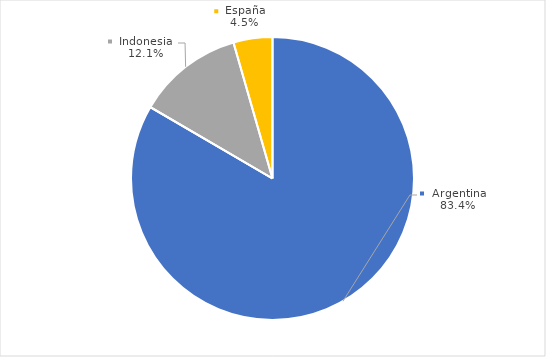
| Category | Series 0 |
|---|---|
| Argentina | 1723.817 |
| Alemania | 0.001 |
| Indonesia | 250.881 |
| España | 92.011 |